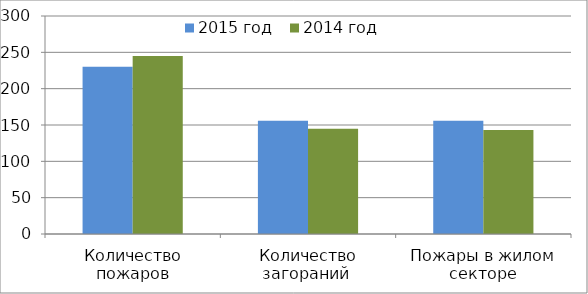
| Category | 2015 год | 2014 год |
|---|---|---|
| Количество пожаров | 230 | 245 |
| Количество загораний  | 156 | 145 |
| Пожары в жилом секторе | 156 | 143 |